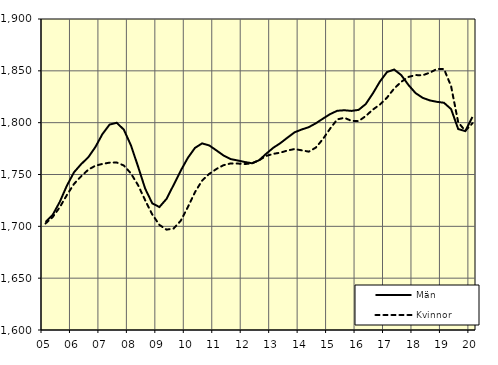
| Category | Män | Kvinnor |
|---|---|---|
| 5.0 | 1704.27 | 1702.77 |
| nan | 1711.04 | 1708.91 |
| 6.0 | 1723.6 | 1718.42 |
| 6.0 | 1739.29 | 1730.22 |
| 6.0 | 1752.15 | 1740.9 |
| nan | 1759.97 | 1748.27 |
| 7.0 | 1766.55 | 1754.59 |
| 7.0 | 1776.45 | 1758.46 |
| 7.0 | 1789.08 | 1760.19 |
| nan | 1798.14 | 1761.45 |
| 8.0 | 1799.91 | 1761.59 |
| 8.0 | 1793.29 | 1758.7 |
| 8.0 | 1778.13 | 1751.03 |
| nan | 1757.73 | 1739.74 |
| 9.0 | 1736.38 | 1725.18 |
| 9.0 | 1722.18 | 1711.46 |
| 9.0 | 1718.61 | 1701.38 |
| nan | 1726.45 | 1696.79 |
| 10.0 | 1739.93 | 1697.9 |
| 10.0 | 1753.68 | 1705.36 |
| 10.0 | 1766.06 | 1718.48 |
| nan | 1775.65 | 1732.93 |
| 11.0 | 1780 | 1744.1 |
| 11.0 | 1778.05 | 1750.58 |
| 11.0 | 1773.32 | 1755.25 |
| nan | 1768.41 | 1758.96 |
| 12.0 | 1764.9 | 1760.66 |
| 12.0 | 1763.53 | 1760.56 |
| 12.0 | 1762.06 | 1760.11 |
| nan | 1760.87 | 1760.7 |
| 13.0 | 1763.67 | 1763.69 |
| 13.0 | 1769.96 | 1767.91 |
| 13.0 | 1775.74 | 1769.9 |
| nan | 1780.23 | 1771.05 |
| 14.0 | 1785.55 | 1773.15 |
| 14.0 | 1790.69 | 1774.55 |
| 14.0 | 1793.42 | 1773.33 |
| nan | 1795.68 | 1772.04 |
| 15.0 | 1799.44 | 1776.01 |
| 15.0 | 1803.94 | 1784.33 |
| 15.0 | 1808.27 | 1794.3 |
| nan | 1811.47 | 1803.16 |
| 16.0 | 1811.98 | 1804.69 |
| 16.0 | 1811.34 | 1801.74 |
| 16.0 | 1812.34 | 1801.5 |
| nan | 1817.93 | 1806.36 |
| 17.0 | 1828.16 | 1812.62 |
| 17.0 | 1839.73 | 1817.42 |
| 17.0 | 1848.86 | 1824.2 |
| nan | 1851.26 | 1832.97 |
| 18.0 | 1845.83 | 1839.43 |
| 18.0 | 1836.4 | 1844.09 |
| 18.0 | 1828.56 | 1845.89 |
| nan | 1823.97 | 1845.76 |
| 19.0 | 1821.49 | 1848.17 |
| 19.0 | 1820.11 | 1851.82 |
| 19.0 | 1819.19 | 1851.78 |
| nan | 1813.07 | 1835.16 |
| 20.0 | 1793.85 | 1800.25 |
| 20.0 | 1791.84 | 1792.17 |
| 20.0 | 1805.53 | 1799.34 |